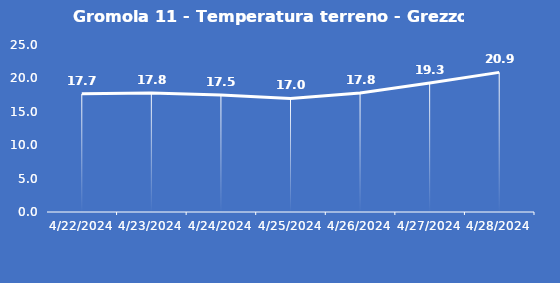
| Category | Gromola 11 - Temperatura terreno - Grezzo (°C) |
|---|---|
| 4/22/24 | 17.7 |
| 4/23/24 | 17.8 |
| 4/24/24 | 17.5 |
| 4/25/24 | 17 |
| 4/26/24 | 17.8 |
| 4/27/24 | 19.3 |
| 4/28/24 | 20.9 |